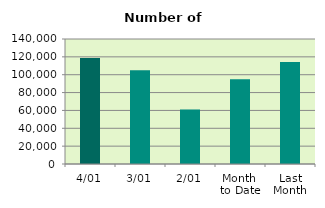
| Category | Series 0 |
|---|---|
| 4/01 | 118674 |
| 3/01 | 105006 |
| 2/01 | 60916 |
| Month 
to Date | 94865.333 |
| Last
Month | 114251.429 |